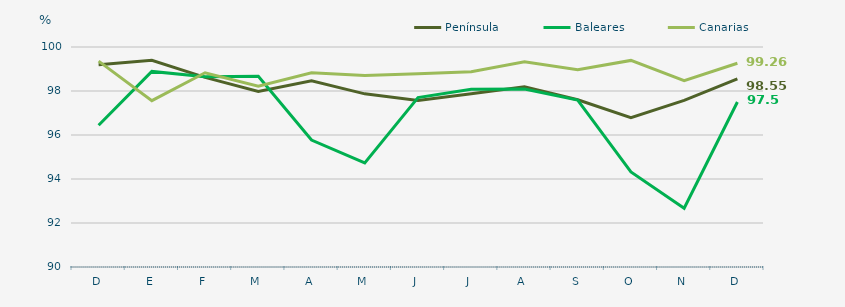
| Category | Península | Baleares | Canarias |
|---|---|---|---|
| D | 99.19 | 96.44 | 99.36 |
| E | 99.4 | 98.89 | 97.56 |
| F | 98.62 | 98.65 | 98.83 |
| M | 97.98 | 98.67 | 98.22 |
| A | 98.46 | 95.77 | 98.83 |
| M | 97.87 | 94.73 | 98.7 |
| J | 97.57 | 97.7 | 98.78 |
| J | 97.87 | 98.08 | 98.88 |
| A | 98.19 | 98.09 | 99.33 |
| S | 97.6 | 97.59 | 98.97 |
| O | 96.79 | 94.32 | 99.39 |
| N | 97.57 | 92.67 | 98.47 |
| D | 98.55 | 97.5 | 99.26 |